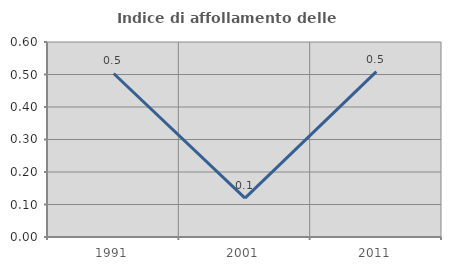
| Category | Indice di affollamento delle abitazioni  |
|---|---|
| 1991.0 | 0.503 |
| 2001.0 | 0.119 |
| 2011.0 | 0.509 |